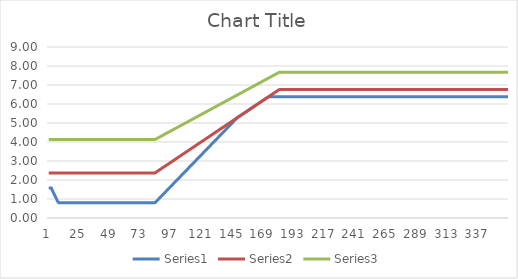
| Category | Series 0 | Series 1 | Series 2 |
|---|---|---|---|
| 0 | 1.577 | 2.37 | 4.129 |
| 1 | 1.577 | 2.37 | 4.129 |
| 2 | 1.577 | 2.37 | 4.129 |
| 3 | 1.437 | 2.37 | 4.129 |
| 4 | 1.298 | 2.37 | 4.129 |
| 5 | 1.159 | 2.37 | 4.129 |
| 6 | 1.019 | 2.37 | 4.129 |
| 7 | 0.88 | 2.37 | 4.129 |
| 8 | 0.798 | 2.37 | 4.129 |
| 9 | 0.798 | 2.37 | 4.129 |
| 10 | 0.798 | 2.37 | 4.129 |
| 11 | 0.798 | 2.37 | 4.129 |
| 12 | 0.798 | 2.37 | 4.129 |
| 13 | 0.798 | 2.37 | 4.129 |
| 14 | 0.798 | 2.37 | 4.129 |
| 15 | 0.798 | 2.37 | 4.129 |
| 16 | 0.798 | 2.37 | 4.129 |
| 17 | 0.798 | 2.37 | 4.129 |
| 18 | 0.798 | 2.37 | 4.129 |
| 19 | 0.798 | 2.37 | 4.129 |
| 20 | 0.798 | 2.37 | 4.129 |
| 21 | 0.798 | 2.37 | 4.129 |
| 22 | 0.798 | 2.37 | 4.129 |
| 23 | 0.798 | 2.37 | 4.129 |
| 24 | 0.798 | 2.37 | 4.129 |
| 25 | 0.798 | 2.37 | 4.129 |
| 26 | 0.798 | 2.37 | 4.129 |
| 27 | 0.798 | 2.37 | 4.129 |
| 28 | 0.798 | 2.37 | 4.129 |
| 29 | 0.798 | 2.37 | 4.129 |
| 30 | 0.798 | 2.37 | 4.129 |
| 31 | 0.798 | 2.37 | 4.129 |
| 32 | 0.798 | 2.37 | 4.129 |
| 33 | 0.798 | 2.37 | 4.129 |
| 34 | 0.798 | 2.37 | 4.129 |
| 35 | 0.798 | 2.37 | 4.129 |
| 36 | 0.798 | 2.37 | 4.129 |
| 37 | 0.798 | 2.37 | 4.129 |
| 38 | 0.798 | 2.37 | 4.129 |
| 39 | 0.798 | 2.37 | 4.129 |
| 40 | 0.798 | 2.37 | 4.129 |
| 41 | 0.798 | 2.37 | 4.129 |
| 42 | 0.798 | 2.37 | 4.129 |
| 43 | 0.798 | 2.37 | 4.129 |
| 44 | 0.798 | 2.37 | 4.129 |
| 45 | 0.798 | 2.37 | 4.129 |
| 46 | 0.798 | 2.37 | 4.129 |
| 47 | 0.798 | 2.37 | 4.129 |
| 48 | 0.798 | 2.37 | 4.129 |
| 49 | 0.798 | 2.37 | 4.129 |
| 50 | 0.798 | 2.37 | 4.129 |
| 51 | 0.798 | 2.37 | 4.129 |
| 52 | 0.798 | 2.37 | 4.129 |
| 53 | 0.798 | 2.37 | 4.129 |
| 54 | 0.798 | 2.37 | 4.129 |
| 55 | 0.798 | 2.37 | 4.129 |
| 56 | 0.798 | 2.37 | 4.129 |
| 57 | 0.798 | 2.37 | 4.129 |
| 58 | 0.798 | 2.37 | 4.129 |
| 59 | 0.798 | 2.37 | 4.129 |
| 60 | 0.798 | 2.37 | 4.129 |
| 61 | 0.798 | 2.37 | 4.129 |
| 62 | 0.798 | 2.37 | 4.129 |
| 63 | 0.798 | 2.37 | 4.129 |
| 64 | 0.798 | 2.37 | 4.129 |
| 65 | 0.798 | 2.37 | 4.129 |
| 66 | 0.798 | 2.37 | 4.129 |
| 67 | 0.798 | 2.37 | 4.129 |
| 68 | 0.798 | 2.37 | 4.129 |
| 69 | 0.798 | 2.37 | 4.129 |
| 70 | 0.798 | 2.37 | 4.129 |
| 71 | 0.798 | 2.37 | 4.129 |
| 72 | 0.798 | 2.37 | 4.129 |
| 73 | 0.798 | 2.37 | 4.129 |
| 74 | 0.798 | 2.37 | 4.129 |
| 75 | 0.798 | 2.37 | 4.129 |
| 76 | 0.798 | 2.37 | 4.129 |
| 77 | 0.798 | 2.37 | 4.129 |
| 78 | 0.798 | 2.37 | 4.129 |
| 79 | 0.798 | 2.37 | 4.129 |
| 80 | 0.798 | 2.37 | 4.129 |
| 81 | 0.798 | 2.37 | 4.129 |
| 82 | 0.798 | 2.37 | 4.129 |
| 83 | 0.798 | 2.37 | 4.129 |
| 84 | 0.868 | 2.415 | 4.165 |
| 85 | 0.938 | 2.46 | 4.202 |
| 86 | 1.007 | 2.506 | 4.238 |
| 87 | 1.077 | 2.551 | 4.275 |
| 88 | 1.147 | 2.596 | 4.311 |
| 89 | 1.216 | 2.641 | 4.348 |
| 90 | 1.286 | 2.687 | 4.384 |
| 91 | 1.356 | 2.732 | 4.421 |
| 92 | 1.425 | 2.777 | 4.457 |
| 93 | 1.495 | 2.822 | 4.494 |
| 94 | 1.565 | 2.867 | 4.53 |
| 95 | 1.634 | 2.913 | 4.567 |
| 96 | 1.704 | 2.958 | 4.603 |
| 97 | 1.774 | 3.003 | 4.64 |
| 98 | 1.843 | 3.048 | 4.676 |
| 99 | 1.913 | 3.094 | 4.713 |
| 100 | 1.983 | 3.139 | 4.749 |
| 101 | 2.052 | 3.184 | 4.786 |
| 102 | 2.122 | 3.229 | 4.822 |
| 103 | 2.192 | 3.274 | 4.858 |
| 104 | 2.261 | 3.32 | 4.895 |
| 105 | 2.331 | 3.365 | 4.931 |
| 106 | 2.401 | 3.41 | 4.968 |
| 107 | 2.47 | 3.455 | 5.004 |
| 108 | 2.54 | 3.501 | 5.041 |
| 109 | 2.61 | 3.546 | 5.077 |
| 110 | 2.679 | 3.591 | 5.114 |
| 111 | 2.749 | 3.636 | 5.15 |
| 112 | 2.819 | 3.681 | 5.187 |
| 113 | 2.888 | 3.727 | 5.223 |
| 114 | 2.958 | 3.772 | 5.26 |
| 115 | 3.028 | 3.817 | 5.296 |
| 116 | 3.097 | 3.862 | 5.333 |
| 117 | 3.167 | 3.907 | 5.369 |
| 118 | 3.237 | 3.953 | 5.406 |
| 119 | 3.306 | 3.998 | 5.442 |
| 120 | 3.376 | 4.043 | 5.479 |
| 121 | 3.446 | 4.088 | 5.515 |
| 122 | 3.515 | 4.134 | 5.552 |
| 123 | 3.585 | 4.179 | 5.588 |
| 124 | 3.655 | 4.224 | 5.625 |
| 125 | 3.724 | 4.269 | 5.661 |
| 126 | 3.794 | 4.314 | 5.698 |
| 127 | 3.864 | 4.36 | 5.734 |
| 128 | 3.933 | 4.405 | 5.77 |
| 129 | 4.003 | 4.45 | 5.807 |
| 130 | 4.073 | 4.495 | 5.843 |
| 131 | 4.142 | 4.541 | 5.88 |
| 132 | 4.212 | 4.586 | 5.916 |
| 133 | 4.282 | 4.631 | 5.953 |
| 134 | 4.351 | 4.676 | 5.989 |
| 135 | 4.421 | 4.721 | 6.026 |
| 136 | 4.491 | 4.767 | 6.062 |
| 137 | 4.56 | 4.812 | 6.099 |
| 138 | 4.63 | 4.857 | 6.135 |
| 139 | 4.7 | 4.902 | 6.172 |
| 140 | 4.769 | 4.948 | 6.208 |
| 141 | 4.839 | 4.993 | 6.245 |
| 142 | 4.909 | 5.038 | 6.281 |
| 143 | 4.978 | 5.083 | 6.318 |
| 144 | 5.048 | 5.128 | 6.354 |
| 145 | 5.118 | 5.174 | 6.391 |
| 146 | 5.187 | 5.219 | 6.427 |
| 147 | 5.257 | 5.264 | 6.464 |
| 148 | 5.309 | 5.309 | 6.5 |
| 149 | 5.355 | 5.355 | 6.537 |
| 150 | 5.4 | 5.4 | 6.573 |
| 151 | 5.445 | 5.445 | 6.609 |
| 152 | 5.49 | 5.49 | 6.646 |
| 153 | 5.535 | 5.535 | 6.682 |
| 154 | 5.581 | 5.581 | 6.719 |
| 155 | 5.626 | 5.626 | 6.755 |
| 156 | 5.671 | 5.671 | 6.792 |
| 157 | 5.716 | 5.716 | 6.828 |
| 158 | 5.762 | 5.762 | 6.865 |
| 159 | 5.807 | 5.807 | 6.901 |
| 160 | 5.852 | 5.852 | 6.938 |
| 161 | 5.897 | 5.897 | 6.974 |
| 162 | 5.942 | 5.942 | 7.011 |
| 163 | 5.988 | 5.988 | 7.047 |
| 164 | 6.033 | 6.033 | 7.083 |
| 165 | 6.078 | 6.078 | 7.12 |
| 166 | 6.123 | 6.123 | 7.156 |
| 167 | 6.169 | 6.169 | 7.193 |
| 168 | 6.214 | 6.214 | 7.229 |
| 169 | 6.259 | 6.259 | 7.266 |
| 170 | 6.304 | 6.304 | 7.302 |
| 171 | 6.349 | 6.349 | 7.339 |
| 172 | 6.387 | 6.395 | 7.375 |
| 173 | 6.387 | 6.44 | 7.412 |
| 174 | 6.387 | 6.485 | 7.448 |
| 175 | 6.387 | 6.53 | 7.484 |
| 176 | 6.387 | 6.576 | 7.521 |
| 177 | 6.387 | 6.621 | 7.557 |
| 178 | 6.387 | 6.666 | 7.594 |
| 179 | 6.387 | 6.711 | 7.63 |
| 180 | 6.387 | 6.756 | 7.667 |
| 181 | 6.387 | 6.758 | 7.668 |
| 182 | 6.387 | 6.758 | 7.668 |
| 183 | 6.387 | 6.758 | 7.668 |
| 184 | 6.387 | 6.758 | 7.668 |
| 185 | 6.387 | 6.758 | 7.668 |
| 186 | 6.387 | 6.758 | 7.668 |
| 187 | 6.387 | 6.758 | 7.668 |
| 188 | 6.387 | 6.758 | 7.668 |
| 189 | 6.387 | 6.758 | 7.668 |
| 190 | 6.387 | 6.758 | 7.668 |
| 191 | 6.387 | 6.758 | 7.668 |
| 192 | 6.387 | 6.758 | 7.668 |
| 193 | 6.387 | 6.758 | 7.668 |
| 194 | 6.387 | 6.758 | 7.668 |
| 195 | 6.387 | 6.758 | 7.668 |
| 196 | 6.387 | 6.758 | 7.668 |
| 197 | 6.387 | 6.758 | 7.668 |
| 198 | 6.387 | 6.758 | 7.668 |
| 199 | 6.387 | 6.758 | 7.668 |
| 200 | 6.387 | 6.758 | 7.668 |
| 201 | 6.387 | 6.758 | 7.668 |
| 202 | 6.387 | 6.758 | 7.668 |
| 203 | 6.387 | 6.758 | 7.668 |
| 204 | 6.387 | 6.758 | 7.668 |
| 205 | 6.387 | 6.758 | 7.668 |
| 206 | 6.387 | 6.758 | 7.668 |
| 207 | 6.387 | 6.758 | 7.668 |
| 208 | 6.387 | 6.758 | 7.668 |
| 209 | 6.387 | 6.758 | 7.668 |
| 210 | 6.387 | 6.758 | 7.668 |
| 211 | 6.387 | 6.758 | 7.668 |
| 212 | 6.387 | 6.758 | 7.668 |
| 213 | 6.387 | 6.758 | 7.668 |
| 214 | 6.387 | 6.758 | 7.668 |
| 215 | 6.387 | 6.758 | 7.668 |
| 216 | 6.387 | 6.758 | 7.668 |
| 217 | 6.387 | 6.758 | 7.668 |
| 218 | 6.387 | 6.758 | 7.668 |
| 219 | 6.387 | 6.758 | 7.668 |
| 220 | 6.387 | 6.758 | 7.668 |
| 221 | 6.387 | 6.758 | 7.668 |
| 222 | 6.387 | 6.758 | 7.668 |
| 223 | 6.387 | 6.758 | 7.668 |
| 224 | 6.387 | 6.758 | 7.668 |
| 225 | 6.387 | 6.758 | 7.668 |
| 226 | 6.387 | 6.758 | 7.668 |
| 227 | 6.387 | 6.758 | 7.668 |
| 228 | 6.387 | 6.758 | 7.668 |
| 229 | 6.387 | 6.758 | 7.668 |
| 230 | 6.387 | 6.758 | 7.668 |
| 231 | 6.387 | 6.758 | 7.668 |
| 232 | 6.387 | 6.758 | 7.668 |
| 233 | 6.387 | 6.758 | 7.668 |
| 234 | 6.387 | 6.758 | 7.668 |
| 235 | 6.387 | 6.758 | 7.668 |
| 236 | 6.387 | 6.758 | 7.668 |
| 237 | 6.387 | 6.758 | 7.668 |
| 238 | 6.387 | 6.758 | 7.668 |
| 239 | 6.387 | 6.758 | 7.668 |
| 240 | 6.387 | 6.758 | 7.668 |
| 241 | 6.387 | 6.758 | 7.668 |
| 242 | 6.387 | 6.758 | 7.668 |
| 243 | 6.387 | 6.758 | 7.668 |
| 244 | 6.387 | 6.758 | 7.668 |
| 245 | 6.387 | 6.758 | 7.668 |
| 246 | 6.387 | 6.758 | 7.668 |
| 247 | 6.387 | 6.758 | 7.668 |
| 248 | 6.387 | 6.758 | 7.668 |
| 249 | 6.387 | 6.758 | 7.668 |
| 250 | 6.387 | 6.758 | 7.668 |
| 251 | 6.387 | 6.758 | 7.668 |
| 252 | 6.387 | 6.758 | 7.668 |
| 253 | 6.387 | 6.758 | 7.668 |
| 254 | 6.387 | 6.758 | 7.668 |
| 255 | 6.387 | 6.758 | 7.668 |
| 256 | 6.387 | 6.758 | 7.668 |
| 257 | 6.387 | 6.758 | 7.668 |
| 258 | 6.387 | 6.758 | 7.668 |
| 259 | 6.387 | 6.758 | 7.668 |
| 260 | 6.387 | 6.758 | 7.668 |
| 261 | 6.387 | 6.758 | 7.668 |
| 262 | 6.387 | 6.758 | 7.668 |
| 263 | 6.387 | 6.758 | 7.668 |
| 264 | 6.387 | 6.758 | 7.668 |
| 265 | 6.387 | 6.758 | 7.668 |
| 266 | 6.387 | 6.758 | 7.668 |
| 267 | 6.387 | 6.758 | 7.668 |
| 268 | 6.387 | 6.758 | 7.668 |
| 269 | 6.387 | 6.758 | 7.668 |
| 270 | 6.387 | 6.758 | 7.668 |
| 271 | 6.387 | 6.758 | 7.668 |
| 272 | 6.387 | 6.758 | 7.668 |
| 273 | 6.387 | 6.758 | 7.668 |
| 274 | 6.387 | 6.758 | 7.668 |
| 275 | 6.387 | 6.758 | 7.668 |
| 276 | 6.387 | 6.758 | 7.668 |
| 277 | 6.387 | 6.758 | 7.668 |
| 278 | 6.387 | 6.758 | 7.668 |
| 279 | 6.387 | 6.758 | 7.668 |
| 280 | 6.387 | 6.758 | 7.668 |
| 281 | 6.387 | 6.758 | 7.668 |
| 282 | 6.387 | 6.758 | 7.668 |
| 283 | 6.387 | 6.758 | 7.668 |
| 284 | 6.387 | 6.758 | 7.668 |
| 285 | 6.387 | 6.758 | 7.668 |
| 286 | 6.387 | 6.758 | 7.668 |
| 287 | 6.387 | 6.758 | 7.668 |
| 288 | 6.387 | 6.758 | 7.668 |
| 289 | 6.387 | 6.758 | 7.668 |
| 290 | 6.387 | 6.758 | 7.668 |
| 291 | 6.387 | 6.758 | 7.668 |
| 292 | 6.387 | 6.758 | 7.668 |
| 293 | 6.387 | 6.758 | 7.668 |
| 294 | 6.387 | 6.758 | 7.668 |
| 295 | 6.387 | 6.758 | 7.668 |
| 296 | 6.387 | 6.758 | 7.668 |
| 297 | 6.387 | 6.758 | 7.668 |
| 298 | 6.387 | 6.758 | 7.668 |
| 299 | 6.387 | 6.758 | 7.668 |
| 300 | 6.387 | 6.758 | 7.668 |
| 301 | 6.387 | 6.758 | 7.668 |
| 302 | 6.387 | 6.758 | 7.668 |
| 303 | 6.387 | 6.758 | 7.668 |
| 304 | 6.387 | 6.758 | 7.668 |
| 305 | 6.387 | 6.758 | 7.668 |
| 306 | 6.387 | 6.758 | 7.668 |
| 307 | 6.387 | 6.758 | 7.668 |
| 308 | 6.387 | 6.758 | 7.668 |
| 309 | 6.387 | 6.758 | 7.668 |
| 310 | 6.387 | 6.758 | 7.668 |
| 311 | 6.387 | 6.758 | 7.668 |
| 312 | 6.387 | 6.758 | 7.668 |
| 313 | 6.387 | 6.758 | 7.668 |
| 314 | 6.387 | 6.758 | 7.668 |
| 315 | 6.387 | 6.758 | 7.668 |
| 316 | 6.387 | 6.758 | 7.668 |
| 317 | 6.387 | 6.758 | 7.668 |
| 318 | 6.387 | 6.758 | 7.668 |
| 319 | 6.387 | 6.758 | 7.668 |
| 320 | 6.387 | 6.758 | 7.668 |
| 321 | 6.387 | 6.758 | 7.668 |
| 322 | 6.387 | 6.758 | 7.668 |
| 323 | 6.387 | 6.758 | 7.668 |
| 324 | 6.387 | 6.758 | 7.668 |
| 325 | 6.387 | 6.758 | 7.668 |
| 326 | 6.387 | 6.758 | 7.668 |
| 327 | 6.387 | 6.758 | 7.668 |
| 328 | 6.387 | 6.758 | 7.668 |
| 329 | 6.387 | 6.758 | 7.668 |
| 330 | 6.387 | 6.758 | 7.668 |
| 331 | 6.387 | 6.758 | 7.668 |
| 332 | 6.387 | 6.758 | 7.668 |
| 333 | 6.387 | 6.758 | 7.668 |
| 334 | 6.387 | 6.758 | 7.668 |
| 335 | 6.387 | 6.758 | 7.668 |
| 336 | 6.387 | 6.758 | 7.668 |
| 337 | 6.387 | 6.758 | 7.668 |
| 338 | 6.387 | 6.758 | 7.668 |
| 339 | 6.387 | 6.758 | 7.668 |
| 340 | 6.387 | 6.758 | 7.668 |
| 341 | 6.387 | 6.758 | 7.668 |
| 342 | 6.387 | 6.758 | 7.668 |
| 343 | 6.387 | 6.758 | 7.668 |
| 344 | 6.387 | 6.758 | 7.668 |
| 345 | 6.387 | 6.758 | 7.668 |
| 346 | 6.387 | 6.758 | 7.668 |
| 347 | 6.387 | 6.758 | 7.668 |
| 348 | 6.387 | 6.758 | 7.668 |
| 349 | 6.387 | 6.758 | 7.668 |
| 350 | 6.387 | 6.758 | 7.668 |
| 351 | 6.387 | 6.758 | 7.668 |
| 352 | 6.387 | 6.758 | 7.668 |
| 353 | 6.387 | 6.758 | 7.668 |
| 354 | 6.387 | 6.758 | 7.668 |
| 355 | 6.387 | 6.758 | 7.668 |
| 356 | 6.387 | 6.758 | 7.668 |
| 357 | 6.387 | 6.758 | 7.668 |
| 358 | 6.387 | 6.758 | 7.668 |
| 359 | 6.387 | 6.758 | 7.668 |